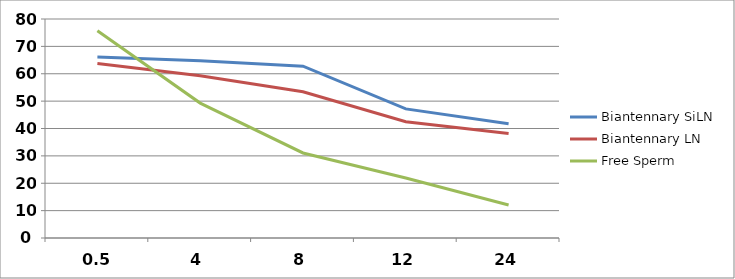
| Category | Biantennary SiLN | Biantennary LN | Free Sperm |
|---|---|---|---|
| 0.5 | 66.095 | 63.726 | 75.74 |
| 4.0 | 64.75 | 59.25 | 49.28 |
| 8.0 | 62.76 | 53.44 | 31.06 |
| 12.0 | 47.16 | 42.45 | 21.92 |
| 24.0 | 41.75 | 38.17 | 12.06 |